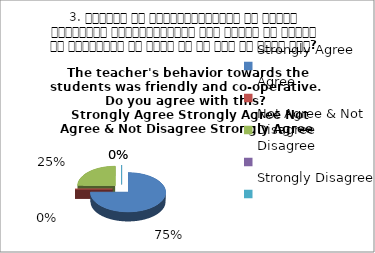
| Category | 3. शिक्षक का विद्यार्थियों के प्रति व्यव्हार मित्रतापूर्ण एवं सहयोग के भावना से परिपूर्ण था क्या आप इस बात से सहमत हैं? 
The teacher's behavior towards the students was friendly and co-operative.  Do you agree with this? 
 Strongly Agree Strongly Agree No |
|---|---|
| Strongly Agree | 3 |
| Agree | 0 |
| Not Agree & Not Disagree | 1 |
| Disagree | 0 |
| Strongly Disagree | 0 |